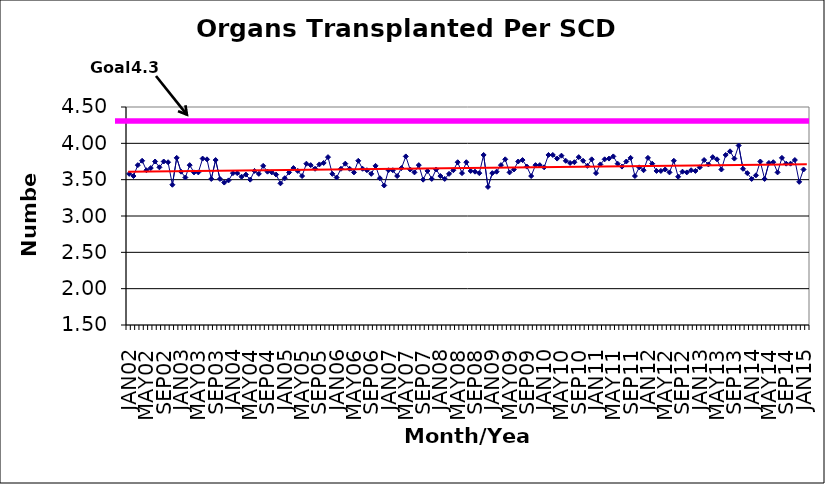
| Category | Series 0 |
|---|---|
| JAN02 | 3.58 |
| FEB02 | 3.55 |
| MAR02 | 3.7 |
| APR02 | 3.76 |
| MAY02 | 3.63 |
| JUN02 | 3.66 |
| JUL02 | 3.75 |
| AUG02 | 3.67 |
| SEP02 | 3.75 |
| OCT02 | 3.74 |
| NOV02 | 3.43 |
| DEC02 | 3.8 |
| JAN03 | 3.61 |
| FEB03 | 3.53 |
| MAR03 | 3.7 |
| APR03 | 3.6 |
| MAY03 | 3.6 |
| JUN03 | 3.79 |
| JUL03 | 3.78 |
| AUG03 | 3.51 |
| SEP03 | 3.77 |
| OCT03 | 3.51 |
| NOV03 | 3.46 |
| DEC03 | 3.49 |
| JAN04 | 3.59 |
| FEB04 | 3.59 |
| MAR04 | 3.54 |
| APR04 | 3.57 |
| MAY04 | 3.5 |
| JUN04 | 3.62 |
| JUL04 | 3.58 |
| AUG04 | 3.69 |
| SEP04 | 3.61 |
| OCT04 | 3.6 |
| NOV04 | 3.57 |
| DEC04 | 3.45 |
| JAN05 | 3.52 |
| FEB05 | 3.6 |
| MAR05 | 3.66 |
| APR05 | 3.62 |
| MAY05 | 3.55 |
| JUN05 | 3.72 |
| JUL05 | 3.7 |
| AUG05 | 3.65 |
| SEP05 | 3.71 |
| OCT05 | 3.73 |
| NOV05 | 3.81 |
| DEC05 | 3.58 |
| JAN06 | 3.53 |
| FEB06 | 3.65 |
| MAR06 | 3.72 |
| APR06 | 3.65 |
| MAY06 | 3.6 |
| JUN06 | 3.76 |
| JUL06 | 3.65 |
| AUG06 | 3.63 |
| SEP06 | 3.58 |
| OCT06 | 3.69 |
| NOV06 | 3.52 |
| DEC06 | 3.42 |
| JAN07 | 3.63 |
| FEB07 | 3.63 |
| MAR07 | 3.55 |
| APR07 | 3.66 |
| MAY07 | 3.82 |
| JUN07 | 3.64 |
| JUL07 | 3.6 |
| AUG07 | 3.7 |
| SEP07 | 3.5 |
| OCT07 | 3.62 |
| NOV07 | 3.51 |
| DEC07 | 3.64 |
| JAN08 | 3.55 |
| FEB08 | 3.51 |
| MAR08 | 3.58 |
| APR08 | 3.63 |
| MAY08 | 3.74 |
| JUN08 | 3.59 |
| JUL08 | 3.74 |
| AUG08 | 3.62 |
| SEP08 | 3.61 |
| OCT08 | 3.59 |
| NOV08 | 3.84 |
| DEC08 | 3.4 |
| JAN09 | 3.59 |
| FEB09 | 3.61 |
| MAR09 | 3.7 |
| APR09 | 3.78 |
| MAY09 | 3.6 |
| JUN09 | 3.64 |
| JUL09 | 3.75 |
| AUG09 | 3.77 |
| SEP09 | 3.68 |
| OCT09 | 3.55 |
| NOV09 | 3.7 |
| DEC09 | 3.7 |
| JAN10 | 3.67 |
| FEB10 | 3.84 |
| MAR10 | 3.84 |
| APR10 | 3.79 |
| MAY10 | 3.83 |
| JUN10 | 3.76 |
| JUL10 | 3.73 |
| AUG10 | 3.74 |
| SEP10 | 3.81 |
| OCT10 | 3.76 |
| NOV10 | 3.69 |
| DEC10 | 3.78 |
| JAN11 | 3.59 |
| FEB11 | 3.71 |
| MAR11 | 3.78 |
| APR11 | 3.79 |
| MAY11 | 3.82 |
| JUN11 | 3.72 |
| JUL11 | 3.68 |
| AUG11 | 3.75 |
| SEP11 | 3.8 |
| OCT11 | 3.55 |
| NOV11 | 3.67 |
| DEC11 | 3.63 |
| JAN12 | 3.8 |
| FEB12 | 3.72 |
| MAR12 | 3.62 |
| APR12 | 3.62 |
| MAY12 | 3.64 |
| JUN12 | 3.6 |
| JUL12 | 3.76 |
| AUG12 | 3.54 |
| SEP12 | 3.61 |
| OCT12 | 3.6 |
| NOV12 | 3.63 |
| DEC12 | 3.62 |
| JAN13 | 3.67 |
| FEB13 | 3.77 |
| MAR13 | 3.71 |
| APR13 | 3.81 |
| MAY13 | 3.78 |
| JUN13 | 3.64 |
| JUL13 | 3.84 |
| AUG13 | 3.89 |
| SEP13 | 3.79 |
| OCT13 | 3.97 |
| NOV13 | 3.65 |
| DEC13 | 3.59 |
| JAN14 | 3.51 |
| FEB14 | 3.56 |
| MAR14 | 3.75 |
| APR14 | 3.51 |
| MAY14 | 3.73 |
| JUN14 | 3.74 |
| JUL14 | 3.6 |
| AUG14 | 3.8 |
| SEP14 | 3.72 |
| OCT14 | 3.72 |
| NOV14 | 3.77 |
| DEC14 | 3.47 |
| JAN15 | 3.64 |